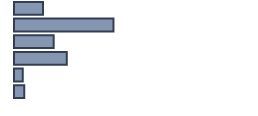
| Category | Percentatge |
|---|---|
| 0 | 12.118 |
| 1 | 41.442 |
| 2 | 16.527 |
| 3 | 21.989 |
| 4 | 3.658 |
| 5 | 4.266 |